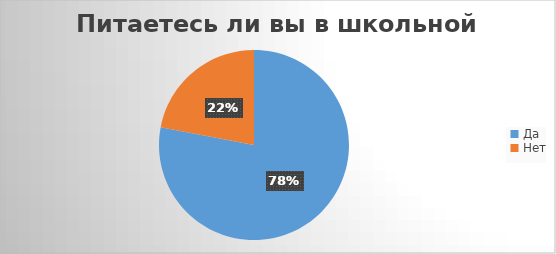
| Category | Series 0 |
|---|---|
| Да | 163 |
| Нет | 46 |